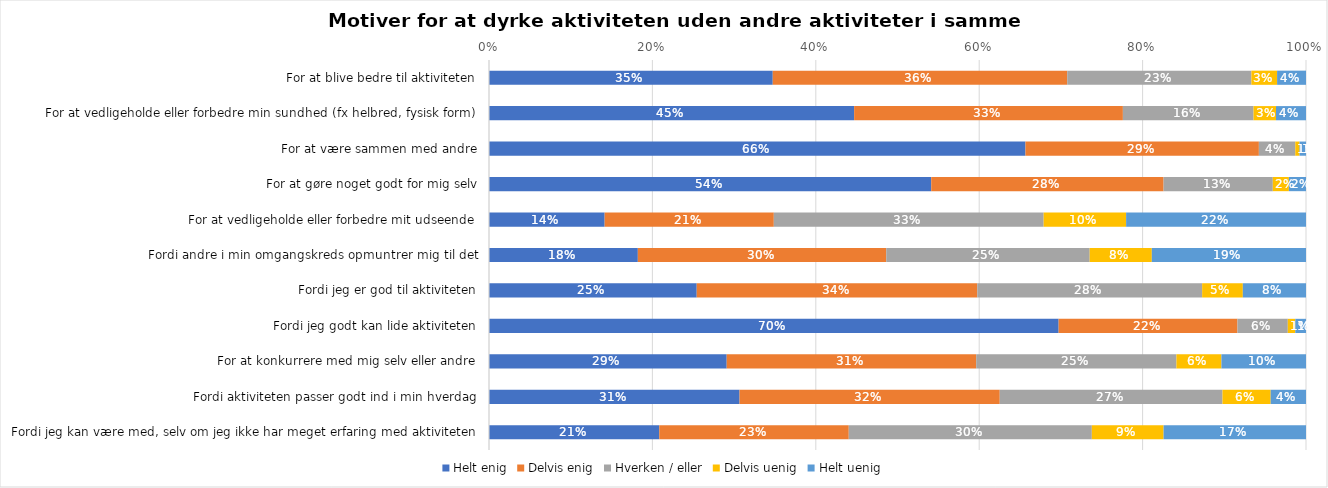
| Category | Helt enig | Delvis enig | Hverken / eller | Delvis uenig | Helt uenig |
|---|---|---|---|---|---|
| For at blive bedre til aktiviteten | 0.347 | 0.36 | 0.225 | 0.031 | 0.035 |
| For at vedligeholde eller forbedre min sundhed (fx helbred, fysisk form) | 0.447 | 0.329 | 0.16 | 0.028 | 0.037 |
| For at være sammen med andre | 0.657 | 0.286 | 0.045 | 0.005 | 0.008 |
| For at gøre noget godt for mig selv | 0.541 | 0.284 | 0.134 | 0.02 | 0.021 |
| For at vedligeholde eller forbedre mit udseende | 0.142 | 0.207 | 0.33 | 0.101 | 0.22 |
| Fordi andre i min omgangskreds opmuntrer mig til det | 0.182 | 0.304 | 0.249 | 0.076 | 0.189 |
| Fordi jeg er god til aktiviteten | 0.254 | 0.343 | 0.275 | 0.05 | 0.077 |
| Fordi jeg godt kan lide aktiviteten | 0.697 | 0.219 | 0.062 | 0.009 | 0.013 |
| For at konkurrere med mig selv eller andre | 0.291 | 0.305 | 0.245 | 0.055 | 0.104 |
| Fordi aktiviteten passer godt ind i min hverdag | 0.307 | 0.318 | 0.273 | 0.059 | 0.043 |
| Fordi jeg kan være med, selv om jeg ikke har meget erfaring med aktiviteten | 0.208 | 0.232 | 0.298 | 0.088 | 0.174 |